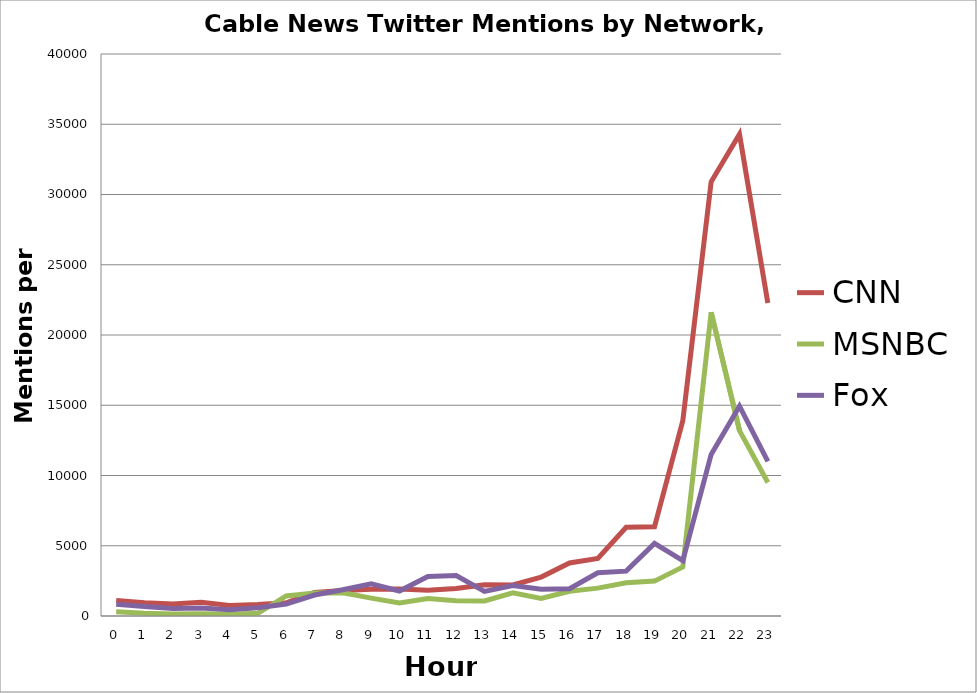
| Category | CNN | MSNBC | Fox |
|---|---|---|---|
| 0.0 | 1112 | 305 | 840 |
| 1.0 | 936 | 201 | 684 |
| 2.0 | 862 | 143 | 531 |
| 3.0 | 984 | 152 | 566 |
| 4.0 | 754 | 126 | 437 |
| 5.0 | 811 | 188 | 586 |
| 6.0 | 939 | 1430 | 853 |
| 7.0 | 1681 | 1634 | 1494 |
| 8.0 | 1818 | 1648 | 1870 |
| 9.0 | 1904 | 1274 | 2292 |
| 10.0 | 1926 | 931 | 1781 |
| 11.0 | 1832 | 1238 | 2808 |
| 12.0 | 1954 | 1078 | 2883 |
| 13.0 | 2227 | 1076 | 1753 |
| 14.0 | 2207 | 1654 | 2175 |
| 15.0 | 2773 | 1246 | 1898 |
| 16.0 | 3775 | 1758 | 1944 |
| 17.0 | 4099 | 1983 | 3077 |
| 18.0 | 6318 | 2361 | 3192 |
| 19.0 | 6344 | 2483 | 5162 |
| 20.0 | 13912 | 3495 | 3947 |
| 21.0 | 30908 | 21622 | 11504 |
| 22.0 | 34289 | 13190 | 14934 |
| 23.0 | 22278 | 9505 | 11007 |